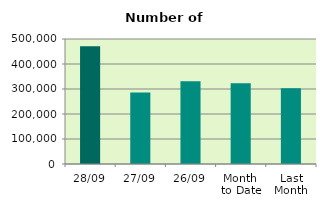
| Category | Series 0 |
|---|---|
| 28/09 | 471406 |
| 27/09 | 286018 |
| 26/09 | 330782 |
| Month 
to Date | 322992.2 |
| Last
Month | 302693.565 |